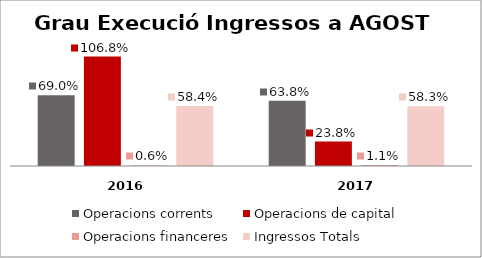
| Category | Operacions corrents | Operacions de capital | Operacions financeres | Ingressos Totals |
|---|---|---|---|---|
| 0 | 0.69 | 1.068 | 0.006 | 0.584 |
| 1 | 0.638 | 0.238 | 0.011 | 0.583 |